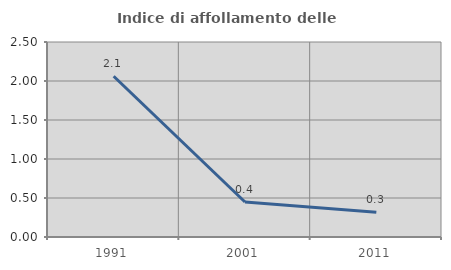
| Category | Indice di affollamento delle abitazioni  |
|---|---|
| 1991.0 | 2.061 |
| 2001.0 | 0.448 |
| 2011.0 | 0.318 |